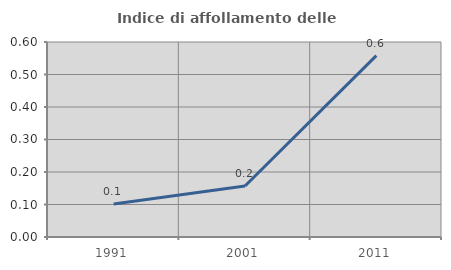
| Category | Indice di affollamento delle abitazioni  |
|---|---|
| 1991.0 | 0.101 |
| 2001.0 | 0.157 |
| 2011.0 | 0.558 |